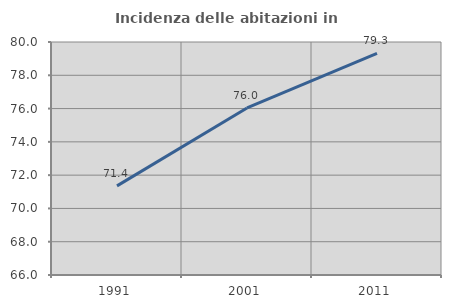
| Category | Incidenza delle abitazioni in proprietà  |
|---|---|
| 1991.0 | 71.357 |
| 2001.0 | 76.037 |
| 2011.0 | 79.31 |